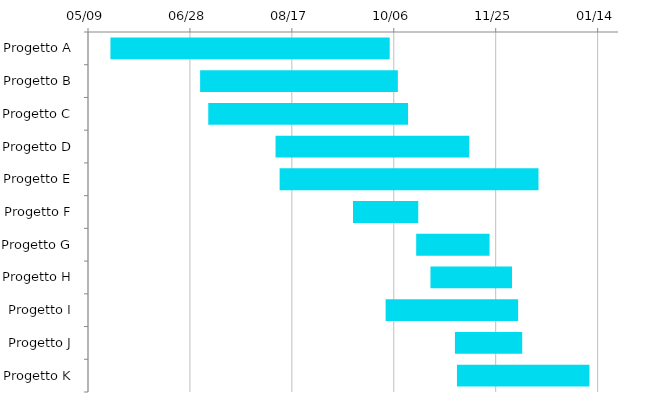
| Category | Inizio | Giorni |
|---|---|---|
| Progetto A | 2022-05-20 | 137 |
| Progetto B | 2022-07-03 | 97 |
| Progetto C | 2022-07-07 | 98 |
| Progetto D | 2022-08-09 | 95 |
| Progetto E | 2022-08-11 | 127 |
| Progetto F | 2022-09-16 | 32 |
| Progetto G | 2022-10-17 | 36 |
| Progetto H | 2022-10-24 | 40 |
| Progetto I | 2022-10-02 | 65 |
| Progetto J | 2022-11-05 | 33 |
| Progetto K | 2022-11-06 | 65 |